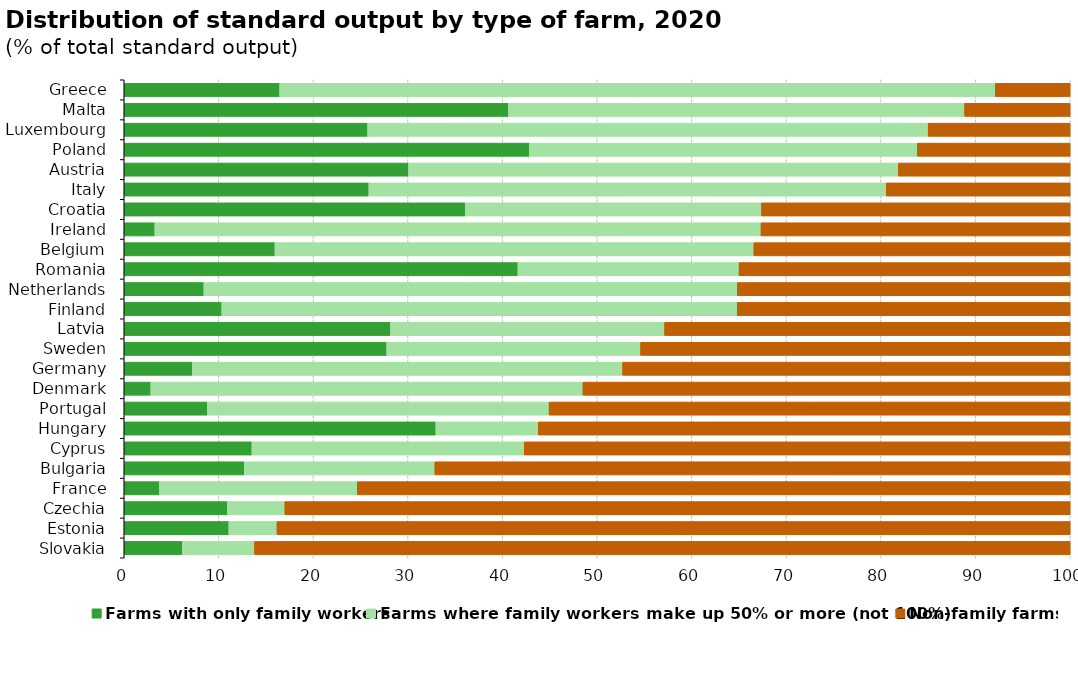
| Category | Farms with only family workers | Farms where family workers make up 50% or more (not 100%) | Non-family farms |
|---|---|---|---|
| Greece | 16.432 | 75.652 | 7.916 |
| Malta | 40.618 | 48.217 | 11.165 |
| Luxembourg | 25.731 | 59.254 | 15.015 |
| Poland | 42.834 | 40.996 | 16.17 |
| Austria | 30.057 | 51.787 | 18.155 |
| Italy | 25.859 | 54.696 | 19.446 |
| Croatia | 36.064 | 31.299 | 32.637 |
| Ireland | 3.238 | 64.076 | 32.686 |
| Belgium | 15.936 | 50.626 | 33.437 |
| Romania | 41.623 | 23.373 | 35.005 |
| Netherlands | 8.423 | 56.383 | 35.195 |
| Finland | 10.312 | 54.488 | 35.199 |
| Latvia | 28.142 | 28.985 | 42.873 |
| Sweden | 27.748 | 26.838 | 45.414 |
| Germany | 7.199 | 45.49 | 47.312 |
| Denmark | 2.813 | 45.681 | 51.506 |
| Portugal | 8.776 | 36.136 | 55.088 |
| Hungary | 32.947 | 10.834 | 56.219 |
| Cyprus | 13.501 | 28.786 | 57.714 |
| Bulgaria | 12.688 | 20.15 | 67.162 |
| France | 3.72 | 20.916 | 75.364 |
| Czechia | 10.904 | 6.081 | 83.015 |
| Estonia | 11.059 | 5.091 | 83.85 |
| Slovakia | 6.152 | 7.624 | 86.223 |